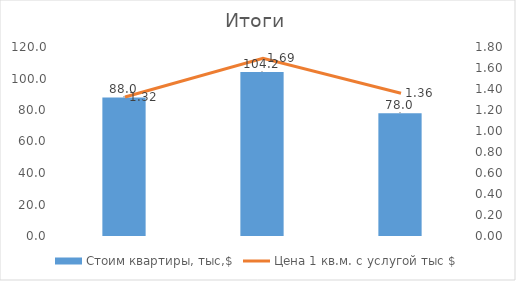
| Category | Стоим квартиры, тыс,$ |
|---|---|
| Вас/Остр | 88 |
| Московс | 104.167 |
| Невский | 78 |